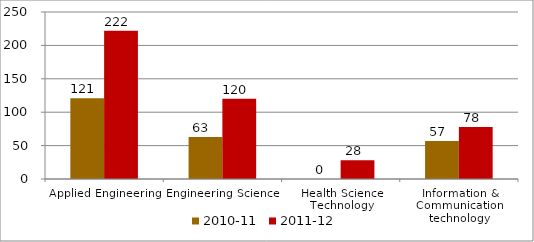
| Category | 2010-11 | 2011-12 |
|---|---|---|
| Applied Engineering | 121 | 222 |
| Engineering Science | 63 | 120 |
| Health Science Technology | 0 | 28 |
| Information & Communication technology | 57 | 78 |